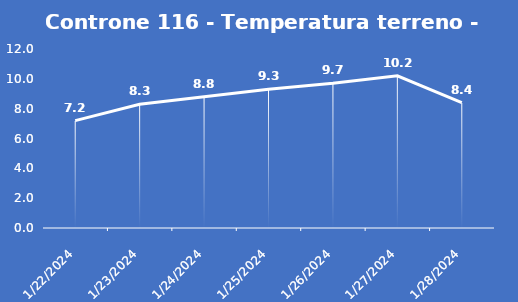
| Category | Controne 116 - Temperatura terreno - Grezzo (°C) |
|---|---|
| 1/22/24 | 7.2 |
| 1/23/24 | 8.3 |
| 1/24/24 | 8.8 |
| 1/25/24 | 9.3 |
| 1/26/24 | 9.7 |
| 1/27/24 | 10.2 |
| 1/28/24 | 8.4 |